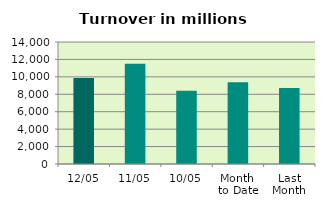
| Category | Series 0 |
|---|---|
| 12/05 | 9857.685 |
| 11/05 | 11497.541 |
| 10/05 | 8403.279 |
| Month 
to Date | 9394.812 |
| Last
Month | 8713.977 |